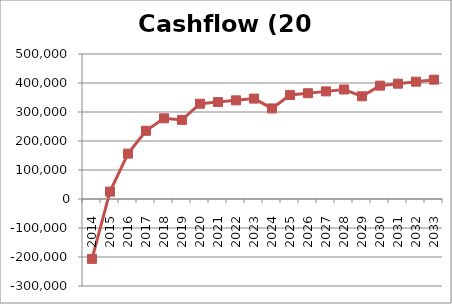
| Category | Series 1 |
|---|---|
| 2014.0 | -206400 |
| 2015.0 | 25468 |
| 2016.0 | 156404.44 |
| 2017.0 | 235256.285 |
| 2018.0 | 278225.252 |
| 2019.0 | 272811.839 |
| 2020.0 | 328521.503 |
| 2021.0 | 334322.963 |
| 2022.0 | 340217.384 |
| 2023.0 | 346205.932 |
| 2024.0 | 312289.776 |
| 2025.0 | 358470.09 |
| 2026.0 | 364748.045 |
| 2027.0 | 371124.816 |
| 2028.0 | 377601.576 |
| 2029.0 | 354179.5 |
| 2030.0 | 390859.759 |
| 2031.0 | 397643.523 |
| 2032.0 | 404531.96 |
| 2033.0 | 411526.232 |